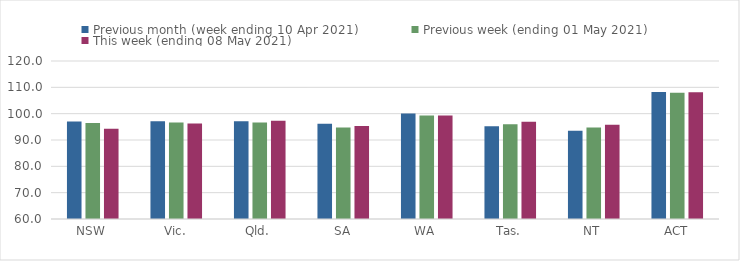
| Category | Previous month (week ending 10 Apr 2021) | Previous week (ending 01 May 2021) | This week (ending 08 May 2021) |
|---|---|---|---|
| NSW | 97.04 | 96.5 | 94.23 |
| Vic. | 97.13 | 96.68 | 96.24 |
| Qld. | 97.15 | 96.64 | 97.31 |
| SA | 96.16 | 94.77 | 95.35 |
| WA | 100.06 | 99.27 | 99.34 |
| Tas. | 95.18 | 96.02 | 96.93 |
| NT | 93.47 | 94.72 | 95.75 |
| ACT | 108.23 | 107.99 | 108.1 |